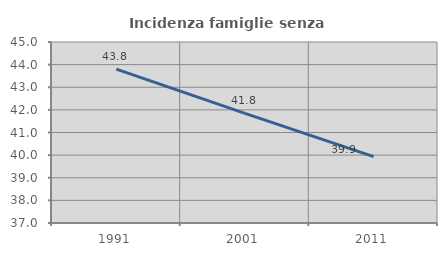
| Category | Incidenza famiglie senza nuclei |
|---|---|
| 1991.0 | 43.798 |
| 2001.0 | 41.844 |
| 2011.0 | 39.931 |